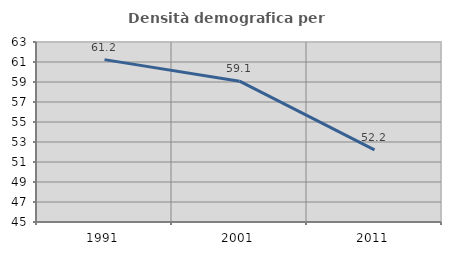
| Category | Densità demografica |
|---|---|
| 1991.0 | 61.237 |
| 2001.0 | 59.08 |
| 2011.0 | 52.22 |